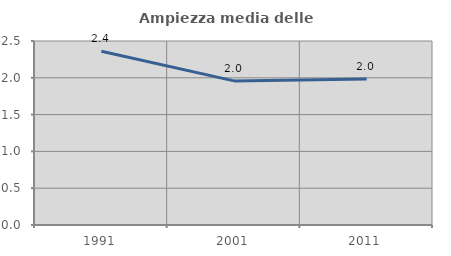
| Category | Ampiezza media delle famiglie |
|---|---|
| 1991.0 | 2.36 |
| 2001.0 | 1.958 |
| 2011.0 | 1.983 |